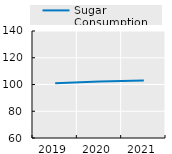
| Category | Sugar Consumption |
|---|---|
| 2019.0 | 100.892 |
| 2020.0 | 102.24 |
| 2021.0 | 103.049 |